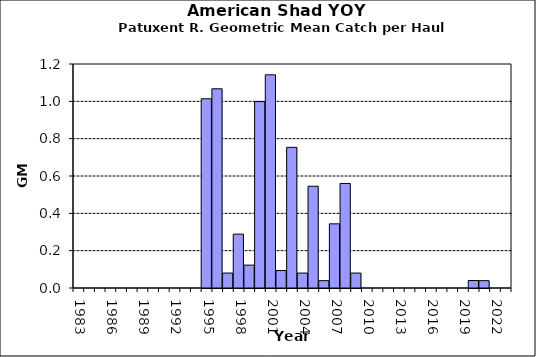
| Category | Series 0 |
|---|---|
| 1983.0 | 0 |
| 1984.0 | 0 |
| 1985.0 | 0 |
| 1986.0 | 0 |
| 1987.0 | 0 |
| 1988.0 | 0 |
| 1989.0 | 0 |
| 1990.0 | 0 |
| 1991.0 | 0 |
| 1992.0 | 0 |
| 1993.0 | 0 |
| 1994.0 | 0 |
| 1995.0 | 1.014 |
| 1996.0 | 1.067 |
| 1997.0 | 0.08 |
| 1998.0 | 0.289 |
| 1999.0 | 0.122 |
| 2000.0 | 0.999 |
| 2001.0 | 1.142 |
| 2002.0 | 0.094 |
| 2003.0 | 0.753 |
| 2004.0 | 0.08 |
| 2005.0 | 0.545 |
| 2006.0 | 0.039 |
| 2007.0 | 0.344 |
| 2008.0 | 0.56 |
| 2009.0 | 0.08 |
| 2010.0 | 0 |
| 2011.0 | 0 |
| 2012.0 | 0 |
| 2013.0 | 0 |
| 2014.0 | 0 |
| 2015.0 | 0 |
| 2016.0 | 0 |
| 2017.0 | 0 |
| 2018.0 | 0 |
| 2019.0 | 0 |
| 2020.0 | 0.04 |
| 2021.0 | 0.039 |
| 2022.0 | 0 |
| 2023.0 | 0 |